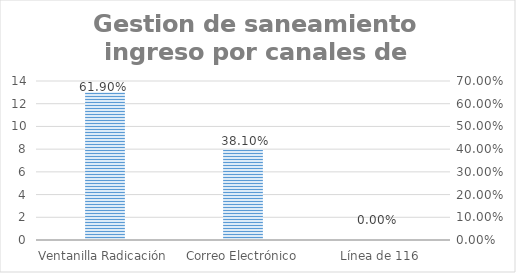
| Category | Series 0 |
|---|---|
| Ventanilla Radicación | 13 |
| Correo Electrónico | 8 |
| Línea de 116 | 0 |